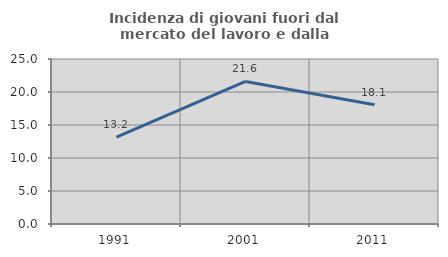
| Category | Incidenza di giovani fuori dal mercato del lavoro e dalla formazione  |
|---|---|
| 1991.0 | 13.158 |
| 2001.0 | 21.604 |
| 2011.0 | 18.054 |